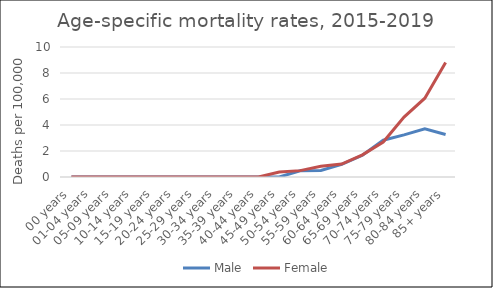
| Category | Male | Female |
|---|---|---|
| 00 years | 0 | 0 |
| 01-04 years | 0 | 0 |
| 05-09 years | 0 | 0 |
| 10-14 years | 0 | 0 |
| 15-19 years | 0 | 0 |
| 20-24 years | 0 | 0 |
| 25-29 years | 0 | 0 |
| 30-34 years | 0 | 0 |
| 35-39 years | 0 | 0 |
| 40-44 years | 0 | 0 |
| 45-49 years | 0 | 0.39 |
| 50-54 years | 0.48 | 0.49 |
| 55-59 years | 0.5 | 0.82 |
| 60-64 years | 0.97 | 1 |
| 65-69 years | 1.67 | 1.7 |
| 70-74 years | 2.83 | 2.69 |
| 75-79 years | 3.24 | 4.61 |
| 80-84 years | 3.71 | 6.06 |
| 85+ years | 3.27 | 8.8 |